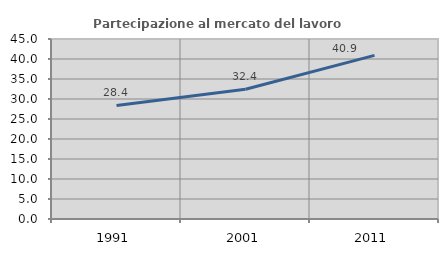
| Category | Partecipazione al mercato del lavoro  femminile |
|---|---|
| 1991.0 | 28.395 |
| 2001.0 | 32.432 |
| 2011.0 | 40.909 |